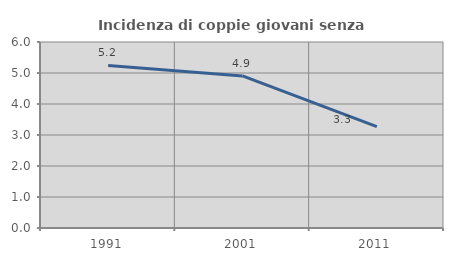
| Category | Incidenza di coppie giovani senza figli |
|---|---|
| 1991.0 | 5.245 |
| 2001.0 | 4.904 |
| 2011.0 | 3.272 |